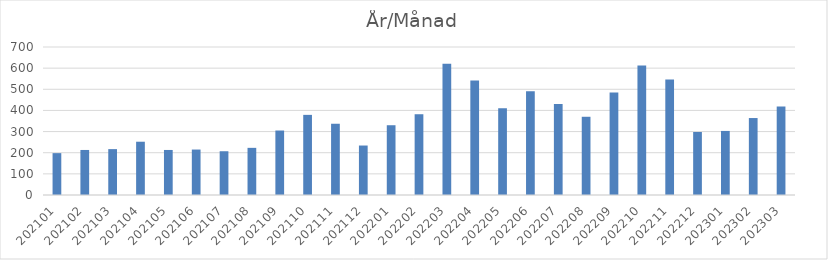
| Category | Summa |
|---|---|
| 202101 | 198 |
| 202102 | 213 |
| 202103 | 217 |
| 202104 | 252 |
| 202105 | 213 |
| 202106 | 215 |
| 202107 | 207 |
| 202108 | 223 |
| 202109 | 305 |
| 202110 | 379 |
| 202111 | 337 |
| 202112 | 234 |
| 202201 | 330 |
| 202202 | 382 |
| 202203 | 621 |
| 202204 | 542 |
| 202205 | 410 |
| 202206 | 491 |
| 202207 | 430 |
| 202208 | 370 |
| 202209 | 485 |
| 202210 | 612 |
| 202211 | 546 |
| 202212 | 298 |
| 202301 | 303 |
| 202302 | 364 |
| 202303 | 418 |